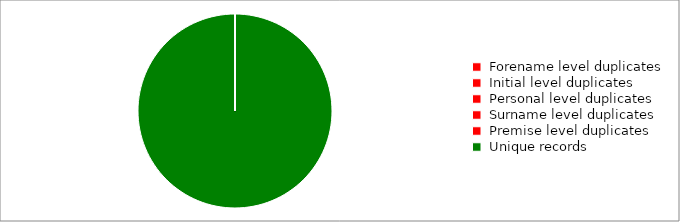
| Category | Series 0 |
|---|---|
|  Forename level duplicates  | 0 |
|  Initial level duplicates  | 0 |
|  Personal level duplicates  | 0 |
|  Surname level duplicates  | 0 |
|  Premise level duplicates  | 0 |
|  Unique records  | 10160 |